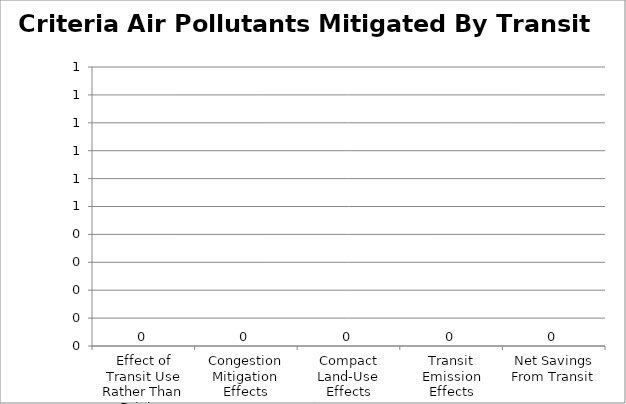
| Category | Criteria Air Pollutants Mitigated By Transit |
|---|---|
| Effect of Transit Use Rather Than Driving | 0 |
| Congestion Mitigation Effects | 0 |
| Compact Land-Use Effects | 0 |
| Transit Emission Effects | 0 |
| Net Savings From Transit | 0 |